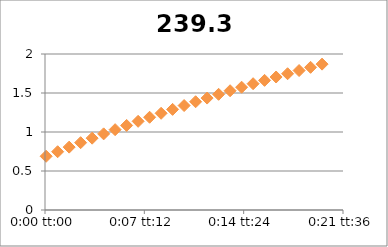
| Category | 239.3 |
|---|---|
| 5.78703703703704e-05 | 0.689 |
| 0.000636574074074074 | 0.747 |
| 0.00121527777777778 | 0.806 |
| 0.00179398148148148 | 0.863 |
| 0.00237268518518518 | 0.921 |
| 0.00295138888888889 | 0.976 |
| 0.00353009259259259 | 1.03 |
| 0.0041087962962963 | 1.084 |
| 0.0046875 | 1.137 |
| 0.0052662037037037 | 1.189 |
| 0.00584490740740741 | 1.24 |
| 0.00642361111111111 | 1.29 |
| 0.00700231481481481 | 1.339 |
| 0.00758101851851852 | 1.388 |
| 0.00815972222222222 | 1.435 |
| 0.00873842592592592 | 1.483 |
| 0.00931712962962963 | 1.529 |
| 0.00989583333333333 | 1.574 |
| 0.010474537037037 | 1.619 |
| 0.0110532407407407 | 1.662 |
| 0.0116319444444444 | 1.705 |
| 0.0122106481481481 | 1.747 |
| 0.0127893518518518 | 1.788 |
| 0.0133680555555556 | 1.829 |
| 0.0139467592592593 | 1.87 |